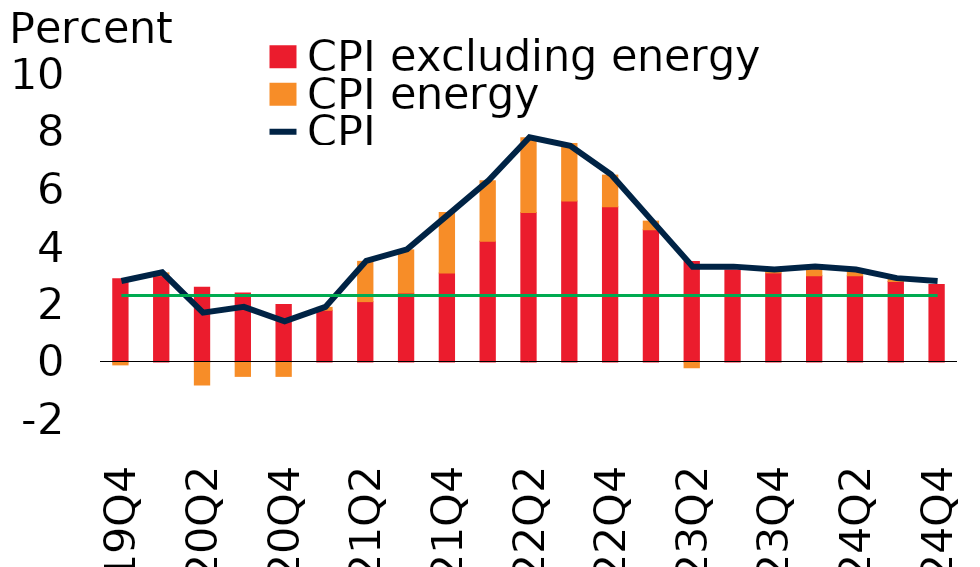
| Category | CPI excluding energy | CPI energy |
|---|---|---|
| 2019Q4 | 2.9 | -0.1 |
| 2020Q1 | 3 | 0.1 |
| 2020Q2 | 2.6 | -0.8 |
| 2020Q3 | 2.4 | -0.5 |
| 2020Q4 | 2 | -0.5 |
| 2021Q1 | 1.8 | 0.1 |
| 2021Q2 | 2.1 | 1.4 |
| 2021Q3 | 2.4 | 1.5 |
| 2021Q4 | 3.1 | 2.1 |
| 2022Q1 | 4.2 | 2.1 |
| 2022Q2 | 5.2 | 2.6 |
| 2022Q3 | 5.6 | 2 |
| 2022Q4 | 5.4 | 1.1 |
| 2023Q1 | 4.6 | 0.3 |
| 2023Q2 | 3.5 | -0.2 |
| 2023Q3 | 3.2 | 0 |
| 2023Q4 | 3.1 | 0.1 |
| 2024Q1 | 3 | 0.3 |
| 2024Q2 | 3 | 0.2 |
| 2024Q3 | 2.8 | 0.1 |
| 2024Q4 | 2.7 | 0 |